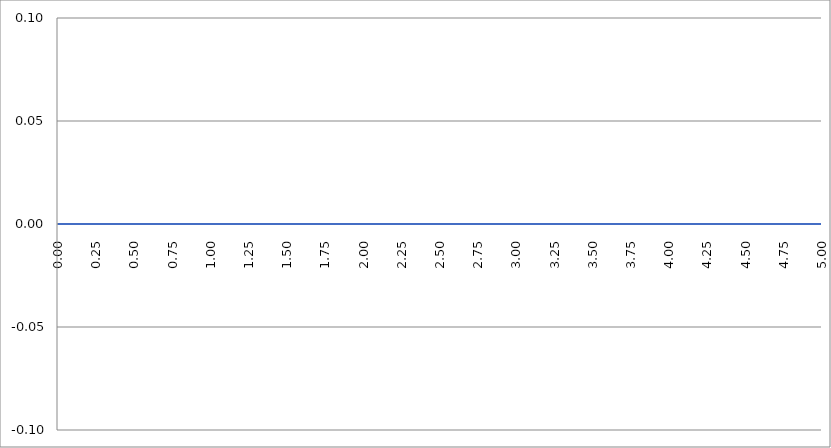
| Category | Series 1 | Series 0 | Series 2 |
|---|---|---|---|
| 0.0 | 0 |  |  |
| 0.0025 | 0 |  |  |
| 0.005 | 0 |  |  |
| 0.0075 | 0 |  |  |
| 0.01 | 0 |  |  |
| 0.0125 | 0 |  |  |
| 0.015 | 0 |  |  |
| 0.0175 | 0 |  |  |
| 0.02 | 0 |  |  |
| 0.0225 | 0 |  |  |
| 0.025 | 0 |  |  |
| 0.0275 | 0 |  |  |
| 0.03 | 0 |  |  |
| 0.0325 | 0 |  |  |
| 0.035 | 0 |  |  |
| 0.0375 | 0 |  |  |
| 0.04 | 0 |  |  |
| 0.0425 | 0 |  |  |
| 0.045 | 0 |  |  |
| 0.0475 | 0 |  |  |
| 0.05 | 0 |  |  |
| 0.0525 | 0 |  |  |
| 0.055 | 0 |  |  |
| 0.0575 | 0 |  |  |
| 0.06 | 0 |  |  |
| 0.0625 | 0 |  |  |
| 0.065 | 0 |  |  |
| 0.0675 | 0 |  |  |
| 0.07 | 0 |  |  |
| 0.0725 | 0 |  |  |
| 0.075 | 0 |  |  |
| 0.0775 | 0 |  |  |
| 0.08 | 0 |  |  |
| 0.0825 | 0 |  |  |
| 0.085 | 0 |  |  |
| 0.0875 | 0 |  |  |
| 0.09 | 0 |  |  |
| 0.0925 | 0 |  |  |
| 0.095 | 0 |  |  |
| 0.0975 | 0 |  |  |
| 0.1 | 0 |  |  |
| 0.1025 | 0 |  |  |
| 0.105 | 0 |  |  |
| 0.1075 | 0 |  |  |
| 0.11 | 0 |  |  |
| 0.1125 | 0 |  |  |
| 0.115 | 0 |  |  |
| 0.1175 | 0 |  |  |
| 0.12 | 0 |  |  |
| 0.1225 | 0 |  |  |
| 0.125 | 0 |  |  |
| 0.1275 | 0 |  |  |
| 0.13 | 0 |  |  |
| 0.1325 | 0 |  |  |
| 0.135 | 0 |  |  |
| 0.1375 | 0 |  |  |
| 0.14 | 0 |  |  |
| 0.1425 | 0 |  |  |
| 0.145 | 0 |  |  |
| 0.1475 | 0 |  |  |
| 0.15 | 0 |  |  |
| 0.1525 | 0 |  |  |
| 0.155 | 0 |  |  |
| 0.1575 | 0 |  |  |
| 0.16 | 0 |  |  |
| 0.1625 | 0 |  |  |
| 0.165 | 0 |  |  |
| 0.1675 | 0 |  |  |
| 0.17 | 0 |  |  |
| 0.1725 | 0 |  |  |
| 0.175 | 0 |  |  |
| 0.1775 | 0 |  |  |
| 0.18 | 0 |  |  |
| 0.1825 | 0 |  |  |
| 0.185 | 0 |  |  |
| 0.1875 | 0 |  |  |
| 0.19 | 0 |  |  |
| 0.1925 | 0 |  |  |
| 0.195 | 0 |  |  |
| 0.1975 | 0 |  |  |
| 0.2 | 0 |  |  |
| 0.2025 | 0 |  |  |
| 0.205 | 0 |  |  |
| 0.2075 | 0 |  |  |
| 0.21 | 0 |  |  |
| 0.2125 | 0 |  |  |
| 0.215 | 0 |  |  |
| 0.2175 | 0 |  |  |
| 0.22 | 0 |  |  |
| 0.2225 | 0 |  |  |
| 0.225 | 0 |  |  |
| 0.2275 | 0 |  |  |
| 0.23 | 0 |  |  |
| 0.2325 | 0 |  |  |
| 0.235 | 0 |  |  |
| 0.2375 | 0 |  |  |
| 0.24 | 0 |  |  |
| 0.2425 | 0 |  |  |
| 0.245 | 0 |  |  |
| 0.2475 | 0 |  |  |
| 0.25 | 0 |  |  |
| 0.2525 | 0 |  |  |
| 0.255 | 0 |  |  |
| 0.2575 | 0 |  |  |
| 0.26 | 0 |  |  |
| 0.2625 | 0 |  |  |
| 0.265 | 0 |  |  |
| 0.2675 | 0 |  |  |
| 0.27 | 0 |  |  |
| 0.2725 | 0 |  |  |
| 0.275 | 0 |  |  |
| 0.2775 | 0 |  |  |
| 0.28 | 0 |  |  |
| 0.2825 | 0 |  |  |
| 0.285 | 0 |  |  |
| 0.2875 | 0 |  |  |
| 0.29 | 0 |  |  |
| 0.2925 | 0 |  |  |
| 0.295 | 0 |  |  |
| 0.2975 | 0 |  |  |
| 0.3 | 0 |  |  |
| 0.3025 | 0 |  |  |
| 0.305 | 0 |  |  |
| 0.3075 | 0 |  |  |
| 0.31 | 0 |  |  |
| 0.3125 | 0 |  |  |
| 0.315 | 0 |  |  |
| 0.3175 | 0 |  |  |
| 0.32 | 0 |  |  |
| 0.3225 | 0 |  |  |
| 0.325 | 0 |  |  |
| 0.3275 | 0 |  |  |
| 0.33 | 0 |  |  |
| 0.3325 | 0 |  |  |
| 0.335 | 0 |  |  |
| 0.3375 | 0 |  |  |
| 0.34 | 0 |  |  |
| 0.3425 | 0 |  |  |
| 0.345 | 0 |  |  |
| 0.3475 | 0 |  |  |
| 0.35 | 0 |  |  |
| 0.3525 | 0 |  |  |
| 0.355 | 0 |  |  |
| 0.3575 | 0 |  |  |
| 0.36 | 0 |  |  |
| 0.3625 | 0 |  |  |
| 0.365 | 0 |  |  |
| 0.3675 | 0 |  |  |
| 0.37 | 0 |  |  |
| 0.3725 | 0 |  |  |
| 0.375 | 0 |  |  |
| 0.3775 | 0 |  |  |
| 0.38 | 0 |  |  |
| 0.3825 | 0 |  |  |
| 0.385 | 0 |  |  |
| 0.3875 | 0 |  |  |
| 0.39 | 0 |  |  |
| 0.3925 | 0 |  |  |
| 0.395 | 0 |  |  |
| 0.3975 | 0 |  |  |
| 0.4 | 0 |  |  |
| 0.4025 | 0 |  |  |
| 0.405 | 0 |  |  |
| 0.4075 | 0 |  |  |
| 0.41 | 0 |  |  |
| 0.4125 | 0 |  |  |
| 0.415 | 0 |  |  |
| 0.4175 | 0 |  |  |
| 0.42 | 0 |  |  |
| 0.4225 | 0 |  |  |
| 0.425 | 0 |  |  |
| 0.4275 | 0 |  |  |
| 0.43 | 0 |  |  |
| 0.4325 | 0 |  |  |
| 0.435 | 0 |  |  |
| 0.4375 | 0 |  |  |
| 0.44 | 0 |  |  |
| 0.4425 | 0 |  |  |
| 0.445 | 0 |  |  |
| 0.4475 | 0 |  |  |
| 0.45 | 0 |  |  |
| 0.4525 | 0 |  |  |
| 0.455 | 0 |  |  |
| 0.4575 | 0 |  |  |
| 0.46 | 0 |  |  |
| 0.4625 | 0 |  |  |
| 0.465 | 0 |  |  |
| 0.4675 | 0 |  |  |
| 0.47 | 0 |  |  |
| 0.4725 | 0 |  |  |
| 0.475 | 0 |  |  |
| 0.4775 | 0 |  |  |
| 0.48 | 0 |  |  |
| 0.4825 | 0 |  |  |
| 0.485 | 0 |  |  |
| 0.4875 | 0 |  |  |
| 0.49 | 0 |  |  |
| 0.4925 | 0 |  |  |
| 0.495 | 0 |  |  |
| 0.4975 | 0 |  |  |
| 0.5 | 0 |  |  |
| 0.5025 | 0 |  |  |
| 0.505 | 0 |  |  |
| 0.5075 | 0 |  |  |
| 0.51 | 0 |  |  |
| 0.5125 | 0 |  |  |
| 0.515 | 0 |  |  |
| 0.5175 | 0 |  |  |
| 0.52 | 0 |  |  |
| 0.5225 | 0 |  |  |
| 0.525 | 0 |  |  |
| 0.5275 | 0 |  |  |
| 0.53 | 0 |  |  |
| 0.5325 | 0 |  |  |
| 0.535 | 0 |  |  |
| 0.5375 | 0 |  |  |
| 0.539999999999999 | 0 |  |  |
| 0.542499999999999 | 0 |  |  |
| 0.544999999999999 | 0 |  |  |
| 0.547499999999999 | 0 |  |  |
| 0.549999999999999 | 0 |  |  |
| 0.552499999999999 | 0 |  |  |
| 0.554999999999999 | 0 |  |  |
| 0.557499999999999 | 0 |  |  |
| 0.559999999999999 | 0 |  |  |
| 0.562499999999999 | 0 |  |  |
| 0.564999999999999 | 0 |  |  |
| 0.567499999999999 | 0 |  |  |
| 0.569999999999999 | 0 |  |  |
| 0.572499999999999 | 0 |  |  |
| 0.574999999999999 | 0 |  |  |
| 0.577499999999999 | 0 |  |  |
| 0.579999999999999 | 0 |  |  |
| 0.582499999999999 | 0 |  |  |
| 0.584999999999999 | 0 |  |  |
| 0.587499999999998 | 0 |  |  |
| 0.589999999999998 | 0 |  |  |
| 0.592499999999998 | 0 |  |  |
| 0.594999999999998 | 0 |  |  |
| 0.597499999999998 | 0 |  |  |
| 0.599999999999998 | 0 |  |  |
| 0.602499999999998 | 0 |  |  |
| 0.604999999999998 | 0 |  |  |
| 0.607499999999998 | 0 |  |  |
| 0.609999999999998 | 0 |  |  |
| 0.612499999999998 | 0 |  |  |
| 0.614999999999998 | 0 |  |  |
| 0.617499999999998 | 0 |  |  |
| 0.619999999999998 | 0 |  |  |
| 0.622499999999998 | 0 |  |  |
| 0.624999999999998 | 0 |  |  |
| 0.627499999999998 | 0 |  |  |
| 0.629999999999997 | 0 |  |  |
| 0.632499999999997 | 0 |  |  |
| 0.634999999999997 | 0 |  |  |
| 0.637499999999997 | 0 |  |  |
| 0.639999999999997 | 0 |  |  |
| 0.642499999999997 | 0 |  |  |
| 0.644999999999997 | 0 |  |  |
| 0.647499999999997 | 0 |  |  |
| 0.649999999999997 | 0 |  |  |
| 0.652499999999997 | 0 |  |  |
| 0.654999999999997 | 0 |  |  |
| 0.657499999999997 | 0 |  |  |
| 0.659999999999997 | 0 |  |  |
| 0.662499999999997 | 0 |  |  |
| 0.664999999999997 | 0 |  |  |
| 0.667499999999997 | 0 |  |  |
| 0.669999999999997 | 0 |  |  |
| 0.672499999999997 | 0 |  |  |
| 0.674999999999997 | 0 |  |  |
| 0.677499999999996 | 0 |  |  |
| 0.679999999999996 | 0 |  |  |
| 0.682499999999996 | 0 |  |  |
| 0.684999999999996 | 0 |  |  |
| 0.687499999999996 | 0 |  |  |
| 0.689999999999996 | 0 |  |  |
| 0.692499999999996 | 0 |  |  |
| 0.694999999999996 | 0 |  |  |
| 0.697499999999996 | 0 |  |  |
| 0.699999999999996 | 0 |  |  |
| 0.702499999999996 | 0 |  |  |
| 0.704999999999996 | 0 |  |  |
| 0.707499999999996 | 0 |  |  |
| 0.709999999999996 | 0 |  |  |
| 0.712499999999996 | 0 |  |  |
| 0.714999999999996 | 0 |  |  |
| 0.717499999999996 | 0 |  |  |
| 0.719999999999996 | 0 |  |  |
| 0.722499999999996 | 0 |  |  |
| 0.724999999999995 | 0 |  |  |
| 0.727499999999995 | 0 |  |  |
| 0.729999999999995 | 0 |  |  |
| 0.732499999999995 | 0 |  |  |
| 0.734999999999995 | 0 |  |  |
| 0.737499999999995 | 0 |  |  |
| 0.739999999999995 | 0 |  |  |
| 0.742499999999995 | 0 |  |  |
| 0.744999999999995 | 0 |  |  |
| 0.747499999999995 | 0 |  |  |
| 0.749999999999995 | 0 |  |  |
| 0.752499999999995 | 0 |  |  |
| 0.754999999999995 | 0 |  |  |
| 0.757499999999995 | 0 |  |  |
| 0.759999999999995 | 0 |  |  |
| 0.762499999999995 | 0 |  |  |
| 0.764999999999995 | 0 |  |  |
| 0.767499999999995 | 0 |  |  |
| 0.769999999999994 | 0 |  |  |
| 0.772499999999994 | 0 |  |  |
| 0.774999999999994 | 0 |  |  |
| 0.777499999999994 | 0 |  |  |
| 0.779999999999994 | 0 |  |  |
| 0.782499999999994 | 0 |  |  |
| 0.784999999999994 | 0 |  |  |
| 0.787499999999994 | 0 |  |  |
| 0.789999999999994 | 0 |  |  |
| 0.792499999999994 | 0 |  |  |
| 0.794999999999994 | 0 |  |  |
| 0.797499999999994 | 0 |  |  |
| 0.799999999999994 | 0 |  |  |
| 0.802499999999994 | 0 |  |  |
| 0.804999999999994 | 0 |  |  |
| 0.807499999999994 | 0 |  |  |
| 0.809999999999994 | 0 |  |  |
| 0.812499999999994 | 0 |  |  |
| 0.814999999999994 | 0 |  |  |
| 0.817499999999994 | 0 |  |  |
| 0.819999999999993 | 0 |  |  |
| 0.822499999999993 | 0 |  |  |
| 0.824999999999993 | 0 |  |  |
| 0.827499999999993 | 0 |  |  |
| 0.829999999999993 | 0 |  |  |
| 0.832499999999993 | 0 |  |  |
| 0.834999999999993 | 0 |  |  |
| 0.837499999999993 | 0 |  |  |
| 0.839999999999993 | 0 |  |  |
| 0.842499999999993 | 0 |  |  |
| 0.844999999999993 | 0 |  |  |
| 0.847499999999993 | 0 |  |  |
| 0.849999999999993 | 0 |  |  |
| 0.852499999999993 | 0 |  |  |
| 0.854999999999993 | 0 |  |  |
| 0.857499999999993 | 0 |  |  |
| 0.859999999999993 | 0 |  |  |
| 0.862499999999993 | 0 |  |  |
| 0.864999999999992 | 0 |  |  |
| 0.867499999999992 | 0 |  |  |
| 0.869999999999992 | 0 |  |  |
| 0.872499999999992 | 0 |  |  |
| 0.874999999999992 | 0 |  |  |
| 0.877499999999992 | 0 |  |  |
| 0.879999999999992 | 0 |  |  |
| 0.882499999999992 | 0 |  |  |
| 0.884999999999992 | 0 |  |  |
| 0.887499999999992 | 0 |  |  |
| 0.889999999999992 | 0 |  |  |
| 0.892499999999992 | 0 |  |  |
| 0.894999999999992 | 0 |  |  |
| 0.897499999999992 | 0 |  |  |
| 0.899999999999992 | 0 |  |  |
| 0.902499999999992 | 0 |  |  |
| 0.904999999999992 | 0 |  |  |
| 0.907499999999992 | 0 |  |  |
| 0.909999999999992 | 0 |  |  |
| 0.912499999999992 | 0 |  |  |
| 0.914999999999991 | 0 |  |  |
| 0.917499999999991 | 0 |  |  |
| 0.919999999999991 | 0 |  |  |
| 0.922499999999991 | 0 |  |  |
| 0.924999999999991 | 0 |  |  |
| 0.927499999999991 | 0 |  |  |
| 0.929999999999991 | 0 |  |  |
| 0.932499999999991 | 0 |  |  |
| 0.934999999999991 | 0 |  |  |
| 0.937499999999991 | 0 |  |  |
| 0.939999999999991 | 0 |  |  |
| 0.942499999999991 | 0 |  |  |
| 0.944999999999991 | 0 |  |  |
| 0.947499999999991 | 0 |  |  |
| 0.949999999999991 | 0 |  |  |
| 0.952499999999991 | 0 |  |  |
| 0.954999999999991 | 0 |  |  |
| 0.957499999999991 | 0 |  |  |
| 0.95999999999999 | 0 |  |  |
| 0.96249999999999 | 0 |  |  |
| 0.96499999999999 | 0 |  |  |
| 0.96749999999999 | 0 |  |  |
| 0.96999999999999 | 0 |  |  |
| 0.97249999999999 | 0 |  |  |
| 0.97499999999999 | 0 |  |  |
| 0.97749999999999 | 0 |  |  |
| 0.97999999999999 | 0 |  |  |
| 0.98249999999999 | 0 |  |  |
| 0.98499999999999 | 0 |  |  |
| 0.98749999999999 | 0 |  |  |
| 0.98999999999999 | 0 |  |  |
| 0.99249999999999 | 0 |  |  |
| 0.99499999999999 | 0 |  |  |
| 0.99749999999999 | 0 |  |  |
| 0.99999999999999 | 0 |  |  |
| 1.00249999999999 | 0 |  |  |
| 1.00499999999999 | 0 |  |  |
| 1.00749999999999 | 0 |  |  |
| 1.00999999999999 | 0 |  |  |
| 1.01249999999999 | 0 |  |  |
| 1.014999999999989 | 0 |  |  |
| 1.017499999999989 | 0 |  |  |
| 1.019999999999989 | 0 |  |  |
| 1.022499999999989 | 0 |  |  |
| 1.024999999999989 | 0 |  |  |
| 1.027499999999989 | 0 |  |  |
| 1.029999999999989 | 0 |  |  |
| 1.032499999999989 | 0 |  |  |
| 1.034999999999989 | 0 |  |  |
| 1.037499999999989 | 0 |  |  |
| 1.039999999999989 | 0 |  |  |
| 1.042499999999989 | 0 |  |  |
| 1.044999999999989 | 0 |  |  |
| 1.047499999999989 | 0 |  |  |
| 1.049999999999989 | 0 |  |  |
| 1.052499999999989 | 0 |  |  |
| 1.054999999999989 | 0 |  |  |
| 1.057499999999989 | 0 |  |  |
| 1.059999999999988 | 0 |  |  |
| 1.062499999999988 | 0 |  |  |
| 1.064999999999988 | 0 |  |  |
| 1.067499999999988 | 0 |  |  |
| 1.069999999999988 | 0 |  |  |
| 1.072499999999988 | 0 |  |  |
| 1.074999999999988 | 0 |  |  |
| 1.077499999999988 | 0 |  |  |
| 1.079999999999988 | 0 |  |  |
| 1.082499999999988 | 0 |  |  |
| 1.084999999999988 | 0 |  |  |
| 1.087499999999988 | 0 |  |  |
| 1.089999999999988 | 0 |  |  |
| 1.092499999999988 | 0 |  |  |
| 1.094999999999988 | 0 |  |  |
| 1.097499999999988 | 0 |  |  |
| 1.099999999999988 | 0 |  |  |
| 1.102499999999988 | 0 |  |  |
| 1.104999999999988 | 0 |  |  |
| 1.107499999999987 | 0 |  |  |
| 1.109999999999987 | 0 |  |  |
| 1.112499999999987 | 0 |  |  |
| 1.114999999999987 | 0 |  |  |
| 1.117499999999987 | 0 |  |  |
| 1.119999999999987 | 0 |  |  |
| 1.122499999999987 | 0 |  |  |
| 1.124999999999987 | 0 |  |  |
| 1.127499999999987 | 0 |  |  |
| 1.129999999999987 | 0 |  |  |
| 1.132499999999987 | 0 |  |  |
| 1.134999999999987 | 0 |  |  |
| 1.137499999999987 | 0 |  |  |
| 1.139999999999987 | 0 |  |  |
| 1.142499999999987 | 0 |  |  |
| 1.144999999999987 | 0 |  |  |
| 1.147499999999987 | 0 |  |  |
| 1.149999999999987 | 0 |  |  |
| 1.152499999999987 | 0 |  |  |
| 1.154999999999986 | 0 |  |  |
| 1.157499999999986 | 0 |  |  |
| 1.159999999999986 | 0 |  |  |
| 1.162499999999986 | 0 |  |  |
| 1.164999999999986 | 0 |  |  |
| 1.167499999999986 | 0 |  |  |
| 1.169999999999986 | 0 |  |  |
| 1.172499999999986 | 0 |  |  |
| 1.174999999999986 | 0 |  |  |
| 1.177499999999986 | 0 |  |  |
| 1.179999999999986 | 0 |  |  |
| 1.182499999999986 | 0 |  |  |
| 1.184999999999986 | 0 |  |  |
| 1.187499999999986 | 0 |  |  |
| 1.189999999999986 | 0 |  |  |
| 1.192499999999986 | 0 |  |  |
| 1.194999999999986 | 0 |  |  |
| 1.197499999999986 | 0 |  |  |
| 1.199999999999985 | 0 |  |  |
| 1.202499999999985 | 0 |  |  |
| 1.204999999999985 | 0 |  |  |
| 1.207499999999985 | 0 |  |  |
| 1.209999999999985 | 0 |  |  |
| 1.212499999999985 | 0 |  |  |
| 1.214999999999985 | 0 |  |  |
| 1.217499999999985 | 0 |  |  |
| 1.219999999999985 | 0 |  |  |
| 1.222499999999985 | 0 |  |  |
| 1.224999999999985 | 0 |  |  |
| 1.227499999999985 | 0 |  |  |
| 1.229999999999985 | 0 |  |  |
| 1.232499999999985 | 0 |  |  |
| 1.234999999999985 | 0 |  |  |
| 1.237499999999985 | 0 |  |  |
| 1.239999999999985 | 0 |  |  |
| 1.242499999999985 | 0 |  |  |
| 1.244999999999985 | 0 |  |  |
| 1.247499999999984 | 0 |  |  |
| 1.249999999999984 | 0 |  |  |
| 1.252499999999984 | 0 |  |  |
| 1.254999999999984 | 0 |  |  |
| 1.257499999999984 | 0 |  |  |
| 1.259999999999984 | 0 |  |  |
| 1.262499999999984 | 0 |  |  |
| 1.264999999999984 | 0 |  |  |
| 1.267499999999984 | 0 |  |  |
| 1.269999999999984 | 0 |  |  |
| 1.272499999999984 | 0 |  |  |
| 1.274999999999984 | 0 |  |  |
| 1.277499999999984 | 0 |  |  |
| 1.279999999999984 | 0 |  |  |
| 1.282499999999984 | 0 |  |  |
| 1.284999999999984 | 0 |  |  |
| 1.287499999999984 | 0 |  |  |
| 1.289999999999984 | 0 |  |  |
| 1.292499999999984 | 0 |  |  |
| 1.294999999999983 | 0 |  |  |
| 1.297499999999983 | 0 |  |  |
| 1.299999999999983 | 0 |  |  |
| 1.302499999999983 | 0 |  |  |
| 1.304999999999983 | 0 |  |  |
| 1.307499999999983 | 0 |  |  |
| 1.309999999999983 | 0 |  |  |
| 1.312499999999983 | 0 |  |  |
| 1.314999999999983 | 0 |  |  |
| 1.317499999999983 | 0 |  |  |
| 1.319999999999983 | 0 |  |  |
| 1.322499999999983 | 0 |  |  |
| 1.324999999999983 | 0 |  |  |
| 1.327499999999983 | 0 |  |  |
| 1.329999999999983 | 0 |  |  |
| 1.332499999999983 | 0 |  |  |
| 1.334999999999983 | 0 |  |  |
| 1.337499999999983 | 0 |  |  |
| 1.339999999999982 | 0 |  |  |
| 1.342499999999982 | 0 |  |  |
| 1.344999999999982 | 0 |  |  |
| 1.347499999999982 | 0 |  |  |
| 1.349999999999982 | 0 |  |  |
| 1.352499999999982 | 0 |  |  |
| 1.354999999999982 | 0 |  |  |
| 1.357499999999982 | 0 |  |  |
| 1.359999999999982 | 0 |  |  |
| 1.362499999999982 | 0 |  |  |
| 1.364999999999982 | 0 |  |  |
| 1.367499999999982 | 0 |  |  |
| 1.369999999999982 | 0 |  |  |
| 1.372499999999982 | 0 |  |  |
| 1.374999999999982 | 0 |  |  |
| 1.377499999999982 | 0 |  |  |
| 1.379999999999982 | 0 |  |  |
| 1.382499999999982 | 0 |  |  |
| 1.384999999999982 | 0 |  |  |
| 1.387499999999981 | 0 |  |  |
| 1.389999999999981 | 0 |  |  |
| 1.392499999999981 | 0 |  |  |
| 1.394999999999981 | 0 |  |  |
| 1.397499999999981 | 0 |  |  |
| 1.399999999999981 | 0 |  |  |
| 1.402499999999981 | 0 |  |  |
| 1.404999999999981 | 0 |  |  |
| 1.407499999999981 | 0 |  |  |
| 1.409999999999981 | 0 |  |  |
| 1.412499999999981 | 0 |  |  |
| 1.414999999999981 | 0 |  |  |
| 1.417499999999981 | 0 |  |  |
| 1.419999999999981 | 0 |  |  |
| 1.422499999999981 | 0 |  |  |
| 1.424999999999981 | 0 |  |  |
| 1.427499999999981 | 0 |  |  |
| 1.429999999999981 | 0 |  |  |
| 1.432499999999981 | 0 |  |  |
| 1.43499999999998 | 0 |  |  |
| 1.43749999999998 | 0 |  |  |
| 1.43999999999998 | 0 |  |  |
| 1.44249999999998 | 0 |  |  |
| 1.44499999999998 | 0 |  |  |
| 1.44749999999998 | 0 |  |  |
| 1.44999999999998 | 0 |  |  |
| 1.45249999999998 | 0 |  |  |
| 1.45499999999998 | 0 |  |  |
| 1.45749999999998 | 0 |  |  |
| 1.45999999999998 | 0 |  |  |
| 1.46249999999998 | 0 |  |  |
| 1.46499999999998 | 0 |  |  |
| 1.46749999999998 | 0 |  |  |
| 1.46999999999998 | 0 |  |  |
| 1.47249999999998 | 0 |  |  |
| 1.47499999999998 | 0 |  |  |
| 1.47749999999998 | 0 |  |  |
| 1.47999999999998 | 0 |  |  |
| 1.482499999999979 | 0 |  |  |
| 1.484999999999979 | 0 |  |  |
| 1.487499999999979 | 0 |  |  |
| 1.489999999999979 | 0 |  |  |
| 1.492499999999979 | 0 |  |  |
| 1.494999999999979 | 0 |  |  |
| 1.497499999999979 | 0 |  |  |
| 1.499999999999979 | 0 |  |  |
| 1.502499999999979 | 0 |  |  |
| 1.504999999999979 | 0 |  |  |
| 1.507499999999979 | 0 |  |  |
| 1.509999999999979 | 0 |  |  |
| 1.512499999999979 | 0 |  |  |
| 1.514999999999979 | 0 |  |  |
| 1.517499999999979 | 0 |  |  |
| 1.519999999999979 | 0 |  |  |
| 1.522499999999979 | 0 |  |  |
| 1.524999999999979 | 0 |  |  |
| 1.527499999999979 | 0 |  |  |
| 1.529999999999978 | 0 |  |  |
| 1.532499999999978 | 0 |  |  |
| 1.534999999999978 | 0 |  |  |
| 1.537499999999978 | 0 |  |  |
| 1.539999999999978 | 0 |  |  |
| 1.542499999999978 | 0 |  |  |
| 1.544999999999978 | 0 |  |  |
| 1.547499999999978 | 0 |  |  |
| 1.549999999999978 | 0 |  |  |
| 1.552499999999978 | 0 |  |  |
| 1.554999999999978 | 0 |  |  |
| 1.557499999999978 | 0 |  |  |
| 1.559999999999978 | 0 |  |  |
| 1.562499999999978 | 0 |  |  |
| 1.564999999999978 | 0 |  |  |
| 1.567499999999978 | 0 |  |  |
| 1.569999999999978 | 0 |  |  |
| 1.572499999999978 | 0 |  |  |
| 1.574999999999978 | 0 |  |  |
| 1.577499999999977 | 0 |  |  |
| 1.579999999999977 | 0 |  |  |
| 1.582499999999977 | 0 |  |  |
| 1.584999999999977 | 0 |  |  |
| 1.587499999999977 | 0 |  |  |
| 1.589999999999977 | 0 |  |  |
| 1.592499999999977 | 0 |  |  |
| 1.594999999999977 | 0 |  |  |
| 1.597499999999977 | 0 |  |  |
| 1.599999999999977 | 0 |  |  |
| 1.602499999999977 | 0 |  |  |
| 1.604999999999977 | 0 |  |  |
| 1.607499999999977 | 0 |  |  |
| 1.609999999999977 | 0 |  |  |
| 1.612499999999977 | 0 |  |  |
| 1.614999999999977 | 0 |  |  |
| 1.617499999999977 | 0 |  |  |
| 1.619999999999976 | 0 |  |  |
| 1.622499999999976 | 0 |  |  |
| 1.624999999999976 | 0 |  |  |
| 1.627499999999976 | 0 |  |  |
| 1.629999999999976 | 0 |  |  |
| 1.632499999999976 | 0 |  |  |
| 1.634999999999976 | 0 |  |  |
| 1.637499999999976 | 0 |  |  |
| 1.639999999999976 | 0 |  |  |
| 1.642499999999976 | 0 |  |  |
| 1.644999999999976 | 0 |  |  |
| 1.647499999999976 | 0 |  |  |
| 1.649999999999976 | 0 |  |  |
| 1.652499999999976 | 0 |  |  |
| 1.654999999999976 | 0 |  |  |
| 1.657499999999976 | 0 |  |  |
| 1.659999999999976 | 0 |  |  |
| 1.662499999999976 | 0 |  |  |
| 1.664999999999976 | 0 |  |  |
| 1.667499999999975 | 0 |  |  |
| 1.669999999999975 | 0 |  |  |
| 1.672499999999975 | 0 |  |  |
| 1.674999999999975 | 0 |  |  |
| 1.677499999999975 | 0 |  |  |
| 1.679999999999975 | 0 |  |  |
| 1.682499999999975 | 0 |  |  |
| 1.684999999999975 | 0 |  |  |
| 1.687499999999975 | 0 |  |  |
| 1.689999999999975 | 0 |  |  |
| 1.692499999999975 | 0 |  |  |
| 1.694999999999975 | 0 |  |  |
| 1.697499999999975 | 0 |  |  |
| 1.699999999999975 | 0 |  |  |
| 1.702499999999975 | 0 |  |  |
| 1.704999999999975 | 0 |  |  |
| 1.707499999999975 | 0 |  |  |
| 1.709999999999975 | 0 |  |  |
| 1.712499999999975 | 0 |  |  |
| 1.714999999999974 | 0 |  |  |
| 1.717499999999974 | 0 |  |  |
| 1.719999999999974 | 0 |  |  |
| 1.722499999999974 | 0 |  |  |
| 1.724999999999974 | 0 |  |  |
| 1.727499999999974 | 0 |  |  |
| 1.729999999999974 | 0 |  |  |
| 1.732499999999974 | 0 |  |  |
| 1.734999999999974 | 0 |  |  |
| 1.737499999999974 | 0 |  |  |
| 1.739999999999974 | 0 |  |  |
| 1.742499999999974 | 0 |  |  |
| 1.744999999999974 | 0 |  |  |
| 1.747499999999974 | 0 |  |  |
| 1.749999999999974 | 0 |  |  |
| 1.752499999999974 | 0 |  |  |
| 1.754999999999974 | 0 |  |  |
| 1.757499999999974 | 0 |  |  |
| 1.759999999999974 | 0 |  |  |
| 1.762499999999973 | 0 |  |  |
| 1.764999999999973 | 0 |  |  |
| 1.767499999999973 | 0 |  |  |
| 1.769999999999973 | 0 |  |  |
| 1.772499999999973 | 0 |  |  |
| 1.774999999999973 | 0 |  |  |
| 1.777499999999973 | 0 |  |  |
| 1.779999999999973 | 0 |  |  |
| 1.782499999999973 | 0 |  |  |
| 1.784999999999973 | 0 |  |  |
| 1.787499999999973 | 0 |  |  |
| 1.789999999999973 | 0 |  |  |
| 1.792499999999973 | 0 |  |  |
| 1.794999999999973 | 0 |  |  |
| 1.797499999999973 | 0 |  |  |
| 1.799999999999973 | 0 |  |  |
| 1.802499999999973 | 0 |  |  |
| 1.804999999999973 | 0 |  |  |
| 1.807499999999973 | 0 |  |  |
| 1.809999999999972 | 0 |  |  |
| 1.812499999999972 | 0 |  |  |
| 1.814999999999972 | 0 |  |  |
| 1.817499999999972 | 0 |  |  |
| 1.819999999999972 | 0 |  |  |
| 1.822499999999972 | 0 |  |  |
| 1.824999999999972 | 0 |  |  |
| 1.827499999999972 | 0 |  |  |
| 1.829999999999972 | 0 |  |  |
| 1.832499999999972 | 0 |  |  |
| 1.834999999999972 | 0 |  |  |
| 1.837499999999972 | 0 |  |  |
| 1.839999999999972 | 0 |  |  |
| 1.842499999999972 | 0 |  |  |
| 1.844999999999972 | 0 |  |  |
| 1.847499999999972 | 0 |  |  |
| 1.849999999999972 | 0 |  |  |
| 1.852499999999972 | 0 |  |  |
| 1.854999999999972 | 0 |  |  |
| 1.857499999999971 | 0 |  |  |
| 1.859999999999971 | 0 |  |  |
| 1.862499999999971 | 0 |  |  |
| 1.864999999999971 | 0 |  |  |
| 1.867499999999971 | 0 |  |  |
| 1.869999999999971 | 0 |  |  |
| 1.872499999999971 | 0 |  |  |
| 1.874999999999971 | 0 |  |  |
| 1.877499999999971 | 0 |  |  |
| 1.879999999999971 | 0 |  |  |
| 1.882499999999971 | 0 |  |  |
| 1.884999999999971 | 0 |  |  |
| 1.887499999999971 | 0 |  |  |
| 1.889999999999971 | 0 |  |  |
| 1.892499999999971 | 0 |  |  |
| 1.894999999999971 | 0 |  |  |
| 1.897499999999971 | 0 |  |  |
| 1.899999999999971 | 0 |  |  |
| 1.902499999999971 | 0 |  |  |
| 1.90499999999997 | 0 |  |  |
| 1.90749999999997 | 0 |  |  |
| 1.90999999999997 | 0 |  |  |
| 1.91249999999997 | 0 |  |  |
| 1.91499999999997 | 0 |  |  |
| 1.91749999999997 | 0 |  |  |
| 1.91999999999997 | 0 |  |  |
| 1.92249999999997 | 0 |  |  |
| 1.92499999999997 | 0 |  |  |
| 1.92749999999997 | 0 |  |  |
| 1.92999999999997 | 0 |  |  |
| 1.93249999999997 | 0 |  |  |
| 1.93499999999997 | 0 |  |  |
| 1.93749999999997 | 0 |  |  |
| 1.93999999999997 | 0 |  |  |
| 1.94249999999997 | 0 |  |  |
| 1.94499999999997 | 0 |  |  |
| 1.94749999999997 | 0 |  |  |
| 1.94999999999997 | 0 |  |  |
| 1.952499999999969 | 0 |  |  |
| 1.954999999999969 | 0 |  |  |
| 1.957499999999969 | 0 |  |  |
| 1.959999999999969 | 0 |  |  |
| 1.962499999999969 | 0 |  |  |
| 1.964999999999969 | 0 |  |  |
| 1.967499999999969 | 0 |  |  |
| 1.969999999999969 | 0 |  |  |
| 1.972499999999969 | 0 |  |  |
| 1.974999999999969 | 0 |  |  |
| 1.977499999999969 | 0 |  |  |
| 1.979999999999969 | 0 |  |  |
| 1.982499999999969 | 0 |  |  |
| 1.984999999999969 | 0 |  |  |
| 1.987499999999969 | 0 |  |  |
| 1.989999999999969 | 0 |  |  |
| 1.992499999999969 | 0 |  |  |
| 1.994999999999969 | 0 |  |  |
| 1.997499999999968 | 0 |  |  |
| 1.999999999999968 | 0 |  |  |
| 2.002499999999968 | 0 |  |  |
| 2.004999999999968 | 0 |  |  |
| 2.007499999999968 | 0 |  |  |
| 2.009999999999968 | 0 |  |  |
| 2.012499999999968 | 0 |  |  |
| 2.014999999999968 | 0 |  |  |
| 2.017499999999968 | 0 |  |  |
| 2.019999999999968 | 0 |  |  |
| 2.022499999999968 | 0 |  |  |
| 2.024999999999968 | 0 |  |  |
| 2.027499999999968 | 0 |  |  |
| 2.029999999999968 | 0 |  |  |
| 2.032499999999968 | 0 |  |  |
| 2.034999999999968 | 0 |  |  |
| 2.037499999999968 | 0 |  |  |
| 2.039999999999968 | 0 |  |  |
| 2.042499999999968 | 0 |  |  |
| 2.044999999999968 | 0 |  |  |
| 2.047499999999967 | 0 |  |  |
| 2.049999999999967 | 0 |  |  |
| 2.052499999999967 | 0 |  |  |
| 2.054999999999967 | 0 |  |  |
| 2.057499999999967 | 0 |  |  |
| 2.059999999999967 | 0 |  |  |
| 2.062499999999967 | 0 |  |  |
| 2.064999999999967 | 0 |  |  |
| 2.067499999999967 | 0 |  |  |
| 2.069999999999967 | 0 |  |  |
| 2.072499999999967 | 0 |  |  |
| 2.074999999999967 | 0 |  |  |
| 2.077499999999967 | 0 |  |  |
| 2.079999999999967 | 0 |  |  |
| 2.082499999999967 | 0 |  |  |
| 2.084999999999967 | 0 |  |  |
| 2.087499999999967 | 0 |  |  |
| 2.089999999999967 | 0 |  |  |
| 2.092499999999966 | 0 |  |  |
| 2.094999999999966 | 0 |  |  |
| 2.097499999999966 | 0 |  |  |
| 2.099999999999966 | 0 |  |  |
| 2.102499999999966 | 0 |  |  |
| 2.104999999999966 | 0 |  |  |
| 2.107499999999966 | 0 |  |  |
| 2.109999999999966 | 0 |  |  |
| 2.112499999999966 | 0 |  |  |
| 2.114999999999966 | 0 |  |  |
| 2.117499999999966 | 0 |  |  |
| 2.119999999999966 | 0 |  |  |
| 2.122499999999966 | 0 |  |  |
| 2.124999999999966 | 0 |  |  |
| 2.127499999999966 | 0 |  |  |
| 2.129999999999966 | 0 |  |  |
| 2.132499999999966 | 0 |  |  |
| 2.134999999999966 | 0 |  |  |
| 2.137499999999966 | 0 |  |  |
| 2.139999999999965 | 0 |  |  |
| 2.142499999999965 | 0 |  |  |
| 2.144999999999965 | 0 |  |  |
| 2.147499999999965 | 0 |  |  |
| 2.149999999999965 | 0 |  |  |
| 2.152499999999965 | 0 |  |  |
| 2.154999999999965 | 0 |  |  |
| 2.157499999999965 | 0 |  |  |
| 2.159999999999965 | 0 |  |  |
| 2.162499999999965 | 0 |  |  |
| 2.164999999999965 | 0 |  |  |
| 2.167499999999965 | 0 |  |  |
| 2.169999999999965 | 0 |  |  |
| 2.172499999999965 | 0 |  |  |
| 2.174999999999965 | 0 |  |  |
| 2.177499999999965 | 0 |  |  |
| 2.179999999999965 | 0 |  |  |
| 2.182499999999965 | 0 |  |  |
| 2.184999999999965 | 0 |  |  |
| 2.187499999999964 | 0 |  |  |
| 2.189999999999964 | 0 |  |  |
| 2.192499999999964 | 0 |  |  |
| 2.194999999999964 | 0 |  |  |
| 2.197499999999964 | 0 |  |  |
| 2.199999999999964 | 0 |  |  |
| 2.202499999999964 | 0 |  |  |
| 2.204999999999964 | 0 |  |  |
| 2.207499999999964 | 0 |  |  |
| 2.209999999999964 | 0 |  |  |
| 2.212499999999964 | 0 |  |  |
| 2.214999999999964 | 0 |  |  |
| 2.217499999999964 | 0 |  |  |
| 2.219999999999964 | 0 |  |  |
| 2.222499999999964 | 0 |  |  |
| 2.224999999999964 | 0 |  |  |
| 2.227499999999964 | 0 |  |  |
| 2.229999999999964 | 0 |  |  |
| 2.232499999999963 | 0 |  |  |
| 2.234999999999963 | 0 |  |  |
| 2.237499999999963 | 0 |  |  |
| 2.239999999999963 | 0 |  |  |
| 2.242499999999963 | 0 |  |  |
| 2.244999999999963 | 0 |  |  |
| 2.247499999999963 | 0 |  |  |
| 2.249999999999963 | 0 |  |  |
| 2.252499999999963 | 0 |  |  |
| 2.254999999999963 | 0 |  |  |
| 2.257499999999963 | 0 |  |  |
| 2.259999999999963 | 0 |  |  |
| 2.262499999999963 | 0 |  |  |
| 2.264999999999963 | 0 |  |  |
| 2.267499999999963 | 0 |  |  |
| 2.269999999999963 | 0 |  |  |
| 2.272499999999963 | 0 |  |  |
| 2.274999999999963 | 0 |  |  |
| 2.277499999999963 | 0 |  |  |
| 2.279999999999962 | 0 |  |  |
| 2.282499999999962 | 0 |  |  |
| 2.284999999999962 | 0 |  |  |
| 2.287499999999962 | 0 |  |  |
| 2.289999999999962 | 0 |  |  |
| 2.292499999999962 | 0 |  |  |
| 2.294999999999962 | 0 |  |  |
| 2.297499999999962 | 0 |  |  |
| 2.299999999999962 | 0 |  |  |
| 2.302499999999962 | 0 |  |  |
| 2.304999999999962 | 0 |  |  |
| 2.307499999999962 | 0 |  |  |
| 2.309999999999962 | 0 |  |  |
| 2.312499999999962 | 0 |  |  |
| 2.314999999999962 | 0 |  |  |
| 2.317499999999962 | 0 |  |  |
| 2.319999999999962 | 0 |  |  |
| 2.322499999999962 | 0 |  |  |
| 2.324999999999961 | 0 |  |  |
| 2.327499999999961 | 0 |  |  |
| 2.329999999999961 | 0 |  |  |
| 2.332499999999961 | 0 |  |  |
| 2.334999999999961 | 0 |  |  |
| 2.337499999999961 | 0 |  |  |
| 2.339999999999961 | 0 |  |  |
| 2.342499999999961 | 0 |  |  |
| 2.344999999999961 | 0 |  |  |
| 2.347499999999961 | 0 |  |  |
| 2.349999999999961 | 0 |  |  |
| 2.352499999999961 | 0 |  |  |
| 2.354999999999961 | 0 |  |  |
| 2.357499999999961 | 0 |  |  |
| 2.359999999999961 | 0 |  |  |
| 2.362499999999961 | 0 |  |  |
| 2.364999999999961 | 0 |  |  |
| 2.367499999999961 | 0 |  |  |
| 2.369999999999961 | 0 |  |  |
| 2.37249999999996 | 0 |  |  |
| 2.37499999999996 | 0 |  |  |
| 2.37749999999996 | 0 |  |  |
| 2.37999999999996 | 0 |  |  |
| 2.38249999999996 | 0 |  |  |
| 2.38499999999996 | 0 |  |  |
| 2.38749999999996 | 0 |  |  |
| 2.38999999999996 | 0 |  |  |
| 2.39249999999996 | 0 |  |  |
| 2.39499999999996 | 0 |  |  |
| 2.39749999999996 | 0 |  |  |
| 2.39999999999996 | 0 |  |  |
| 2.40249999999996 | 0 |  |  |
| 2.40499999999996 | 0 |  |  |
| 2.40749999999996 | 0 |  |  |
| 2.40999999999996 | 0 |  |  |
| 2.41249999999996 | 0 |  |  |
| 2.41499999999996 | 0 |  |  |
| 2.41749999999996 | 0 |  |  |
| 2.419999999999959 | 0 |  |  |
| 2.422499999999959 | 0 |  |  |
| 2.424999999999959 | 0 |  |  |
| 2.427499999999959 | 0 |  |  |
| 2.429999999999959 | 0 |  |  |
| 2.432499999999959 | 0 |  |  |
| 2.434999999999959 | 0 |  |  |
| 2.437499999999959 | 0 |  |  |
| 2.439999999999959 | 0 |  |  |
| 2.442499999999959 | 0 |  |  |
| 2.444999999999959 | 0 |  |  |
| 2.447499999999959 | 0 |  |  |
| 2.449999999999959 | 0 |  |  |
| 2.452499999999959 | 0 |  |  |
| 2.454999999999959 | 0 |  |  |
| 2.457499999999959 | 0 |  |  |
| 2.459999999999959 | 0 |  |  |
| 2.462499999999959 | 0 |  |  |
| 2.464999999999959 | 0 |  |  |
| 2.467499999999958 | 0 |  |  |
| 2.469999999999958 | 0 |  |  |
| 2.472499999999958 | 0 |  |  |
| 2.474999999999958 | 0 |  |  |
| 2.477499999999958 | 0 |  |  |
| 2.479999999999958 | 0 |  |  |
| 2.482499999999958 | 0 |  |  |
| 2.484999999999958 | 0 |  |  |
| 2.487499999999958 | 0 |  |  |
| 2.489999999999958 | 0 |  |  |
| 2.492499999999958 | 0 |  |  |
| 2.494999999999958 | 0 |  |  |
| 2.497499999999958 | 0 |  |  |
| 2.499999999999958 | 0 |  |  |
| 2.502499999999958 | 0 |  |  |
| 2.504999999999958 | 0 |  |  |
| 2.507499999999958 | 0 |  |  |
| 2.509999999999958 | 0 |  |  |
| 2.512499999999958 | 0 |  |  |
| 2.514999999999957 | 0 |  |  |
| 2.517499999999957 | 0 |  |  |
| 2.519999999999957 | 0 |  |  |
| 2.522499999999957 | 0 |  |  |
| 2.524999999999957 | 0 |  |  |
| 2.527499999999957 | 0 |  |  |
| 2.529999999999957 | 0 |  |  |
| 2.532499999999957 | 0 |  |  |
| 2.534999999999957 | 0 |  |  |
| 2.537499999999957 | 0 |  |  |
| 2.539999999999957 | 0 |  |  |
| 2.542499999999957 | 0 |  |  |
| 2.544999999999957 | 0 |  |  |
| 2.547499999999957 | 0 |  |  |
| 2.549999999999957 | 0 |  |  |
| 2.552499999999957 | 0 |  |  |
| 2.554999999999957 | 0 |  |  |
| 2.557499999999957 | 0 |  |  |
| 2.559999999999957 | 0 |  |  |
| 2.562499999999956 | 0 |  |  |
| 2.564999999999956 | 0 |  |  |
| 2.567499999999956 | 0 |  |  |
| 2.569999999999956 | 0 |  |  |
| 2.572499999999956 | 0 |  |  |
| 2.574999999999956 | 0 |  |  |
| 2.577499999999956 | 0 |  |  |
| 2.579999999999956 | 0 |  |  |
| 2.582499999999956 | 0 |  |  |
| 2.584999999999956 | 0 |  |  |
| 2.587499999999956 | 0 |  |  |
| 2.589999999999956 | 0 |  |  |
| 2.592499999999956 | 0 |  |  |
| 2.594999999999956 | 0 |  |  |
| 2.597499999999956 | 0 |  |  |
| 2.599999999999956 | 0 |  |  |
| 2.602499999999956 | 0 |  |  |
| 2.604999999999955 | 0 |  |  |
| 2.607499999999955 | 0 |  |  |
| 2.609999999999955 | 0 |  |  |
| 2.612499999999955 | 0 |  |  |
| 2.614999999999955 | 0 |  |  |
| 2.617499999999955 | 0 |  |  |
| 2.619999999999955 | 0 |  |  |
| 2.622499999999955 | 0 |  |  |
| 2.624999999999955 | 0 |  |  |
| 2.627499999999955 | 0 |  |  |
| 2.629999999999955 | 0 |  |  |
| 2.632499999999955 | 0 |  |  |
| 2.634999999999955 | 0 |  |  |
| 2.637499999999955 | 0 |  |  |
| 2.639999999999955 | 0 |  |  |
| 2.642499999999955 | 0 |  |  |
| 2.644999999999955 | 0 |  |  |
| 2.647499999999955 | 0 |  |  |
| 2.649999999999955 | 0 |  |  |
| 2.652499999999954 | 0 |  |  |
| 2.654999999999954 | 0 |  |  |
| 2.657499999999954 | 0 |  |  |
| 2.659999999999954 | 0 |  |  |
| 2.662499999999954 | 0 |  |  |
| 2.664999999999954 | 0 |  |  |
| 2.667499999999954 | 0 |  |  |
| 2.669999999999954 | 0 |  |  |
| 2.672499999999954 | 0 |  |  |
| 2.674999999999954 | 0 |  |  |
| 2.677499999999954 | 0 |  |  |
| 2.679999999999954 | 0 |  |  |
| 2.682499999999954 | 0 |  |  |
| 2.684999999999954 | 0 |  |  |
| 2.687499999999954 | 0 |  |  |
| 2.689999999999954 | 0 |  |  |
| 2.692499999999954 | 0 |  |  |
| 2.694999999999954 | 0 |  |  |
| 2.697499999999953 | 0 |  |  |
| 2.699999999999953 | 0 |  |  |
| 2.702499999999953 | 0 |  |  |
| 2.704999999999953 | 0 |  |  |
| 2.707499999999953 | 0 |  |  |
| 2.709999999999953 | 0 |  |  |
| 2.712499999999953 | 0 |  |  |
| 2.714999999999953 | 0 |  |  |
| 2.717499999999953 | 0 |  |  |
| 2.719999999999953 | 0 |  |  |
| 2.722499999999953 | 0 |  |  |
| 2.724999999999953 | 0 |  |  |
| 2.727499999999953 | 0 |  |  |
| 2.729999999999953 | 0 |  |  |
| 2.732499999999953 | 0 |  |  |
| 2.734999999999953 | 0 |  |  |
| 2.737499999999953 | 0 |  |  |
| 2.739999999999953 | 0 |  |  |
| 2.742499999999953 | 0 |  |  |
| 2.744999999999952 | 0 |  |  |
| 2.747499999999952 | 0 |  |  |
| 2.749999999999952 | 0 |  |  |
| 2.752499999999952 | 0 |  |  |
| 2.754999999999952 | 0 |  |  |
| 2.757499999999952 | 0 |  |  |
| 2.759999999999952 | 0 |  |  |
| 2.762499999999952 | 0 |  |  |
| 2.764999999999952 | 0 |  |  |
| 2.767499999999952 | 0 |  |  |
| 2.769999999999952 | 0 |  |  |
| 2.772499999999952 | 0 |  |  |
| 2.774999999999952 | 0 |  |  |
| 2.777499999999952 | 0 |  |  |
| 2.779999999999952 | 0 |  |  |
| 2.782499999999952 | 0 |  |  |
| 2.784999999999952 | 0 |  |  |
| 2.787499999999952 | 0 |  |  |
| 2.789999999999952 | 0 |  |  |
| 2.792499999999951 | 0 |  |  |
| 2.794999999999951 | 0 |  |  |
| 2.797499999999951 | 0 |  |  |
| 2.799999999999951 | 0 |  |  |
| 2.802499999999951 | 0 |  |  |
| 2.804999999999951 | 0 |  |  |
| 2.807499999999951 | 0 |  |  |
| 2.809999999999951 | 0 |  |  |
| 2.812499999999951 | 0 |  |  |
| 2.814999999999951 | 0 |  |  |
| 2.817499999999951 | 0 |  |  |
| 2.819999999999951 | 0 |  |  |
| 2.822499999999951 | 0 |  |  |
| 2.824999999999951 | 0 |  |  |
| 2.827499999999951 | 0 |  |  |
| 2.829999999999951 | 0 |  |  |
| 2.832499999999951 | 0 |  |  |
| 2.834999999999951 | 0 |  |  |
| 2.837499999999951 | 0 |  |  |
| 2.839999999999951 | 0 |  |  |
| 2.84249999999995 | 0 |  |  |
| 2.84499999999995 | 0 |  |  |
| 2.84749999999995 | 0 |  |  |
| 2.84999999999995 | 0 |  |  |
| 2.85249999999995 | 0 |  |  |
| 2.85499999999995 | 0 |  |  |
| 2.85749999999995 | 0 |  |  |
| 2.85999999999995 | 0 |  |  |
| 2.86249999999995 | 0 |  |  |
| 2.86499999999995 | 0 |  |  |
| 2.86749999999995 | 0 |  |  |
| 2.86999999999995 | 0 |  |  |
| 2.87249999999995 | 0 |  |  |
| 2.87499999999995 | 0 |  |  |
| 2.87749999999995 | 0 |  |  |
| 2.87999999999995 | 0 |  |  |
| 2.88249999999995 | 0 |  |  |
| 2.88499999999995 | 0 |  |  |
| 2.887499999999949 | 0 |  |  |
| 2.889999999999949 | 0 |  |  |
| 2.892499999999949 | 0 |  |  |
| 2.894999999999949 | 0 |  |  |
| 2.897499999999949 | 0 |  |  |
| 2.899999999999949 | 0 |  |  |
| 2.902499999999949 | 0 |  |  |
| 2.904999999999949 | 0 |  |  |
| 2.907499999999949 | 0 |  |  |
| 2.909999999999949 | 0 |  |  |
| 2.912499999999949 | 0 |  |  |
| 2.914999999999949 | 0 |  |  |
| 2.917499999999949 | 0 |  |  |
| 2.919999999999949 | 0 |  |  |
| 2.922499999999949 | 0 |  |  |
| 2.924999999999949 | 0 |  |  |
| 2.927499999999949 | 0 |  |  |
| 2.929999999999949 | 0 |  |  |
| 2.932499999999949 | 0 |  |  |
| 2.934999999999949 | 0 |  |  |
| 2.937499999999948 | 0 |  |  |
| 2.939999999999948 | 0 |  |  |
| 2.942499999999948 | 0 |  |  |
| 2.944999999999948 | 0 |  |  |
| 2.947499999999948 | 0 |  |  |
| 2.949999999999948 | 0 |  |  |
| 2.952499999999948 | 0 |  |  |
| 2.954999999999948 | 0 |  |  |
| 2.957499999999948 | 0 |  |  |
| 2.959999999999948 | 0 |  |  |
| 2.962499999999948 | 0 |  |  |
| 2.964999999999948 | 0 |  |  |
| 2.967499999999948 | 0 |  |  |
| 2.969999999999948 | 0 |  |  |
| 2.972499999999948 | 0 |  |  |
| 2.974999999999948 | 0 |  |  |
| 2.977499999999948 | 0 |  |  |
| 2.979999999999948 | 0 |  |  |
| 2.982499999999947 | 0 |  |  |
| 2.984999999999947 | 0 |  |  |
| 2.987499999999947 | 0 |  |  |
| 2.989999999999947 | 0 |  |  |
| 2.992499999999947 | 0 |  |  |
| 2.994999999999947 | 0 |  |  |
| 2.997499999999947 | 0 |  |  |
| 2.999999999999947 | 0 |  |  |
| 3.002499999999947 | 0 |  |  |
| 3.004999999999947 | 0 |  |  |
| 3.007499999999947 | 0 |  |  |
| 3.009999999999947 | 0 |  |  |
| 3.012499999999947 | 0 |  |  |
| 3.014999999999947 | 0 |  |  |
| 3.017499999999947 | 0 |  |  |
| 3.019999999999947 | 0 |  |  |
| 3.022499999999947 | 0 |  |  |
| 3.024999999999947 | 0 |  |  |
| 3.027499999999947 | 0 |  |  |
| 3.029999999999947 | 0 |  |  |
| 3.032499999999946 | 0 |  |  |
| 3.034999999999946 | 0 |  |  |
| 3.037499999999946 | 0 |  |  |
| 3.039999999999946 | 0 |  |  |
| 3.042499999999946 | 0 |  |  |
| 3.044999999999946 | 0 |  |  |
| 3.047499999999946 | 0 |  |  |
| 3.049999999999946 | 0 |  |  |
| 3.052499999999946 | 0 |  |  |
| 3.054999999999946 | 0 |  |  |
| 3.057499999999946 | 0 |  |  |
| 3.059999999999946 | 0 |  |  |
| 3.062499999999946 | 0 |  |  |
| 3.064999999999946 | 0 |  |  |
| 3.067499999999946 | 0 |  |  |
| 3.069999999999946 | 0 |  |  |
| 3.072499999999946 | 0 |  |  |
| 3.074999999999946 | 0 |  |  |
| 3.077499999999945 | 0 |  |  |
| 3.079999999999945 | 0 |  |  |
| 3.082499999999945 | 0 |  |  |
| 3.084999999999945 | 0 |  |  |
| 3.087499999999945 | 0 |  |  |
| 3.089999999999945 | 0 |  |  |
| 3.092499999999945 | 0 |  |  |
| 3.094999999999945 | 0 |  |  |
| 3.097499999999945 | 0 |  |  |
| 3.099999999999945 | 0 |  |  |
| 3.102499999999945 | 0 |  |  |
| 3.104999999999945 | 0 |  |  |
| 3.107499999999945 | 0 |  |  |
| 3.109999999999945 | 0 |  |  |
| 3.112499999999945 | 0 |  |  |
| 3.114999999999945 | 0 |  |  |
| 3.117499999999945 | 0 |  |  |
| 3.119999999999945 | 0 |  |  |
| 3.122499999999945 | 0 |  |  |
| 3.124999999999944 | 0 |  |  |
| 3.127499999999944 | 0 |  |  |
| 3.129999999999944 | 0 |  |  |
| 3.132499999999944 | 0 |  |  |
| 3.134999999999944 | 0 |  |  |
| 3.137499999999944 | 0 |  |  |
| 3.139999999999944 | 0 |  |  |
| 3.142499999999944 | 0 |  |  |
| 3.144999999999944 | 0 |  |  |
| 3.147499999999944 | 0 |  |  |
| 3.149999999999944 | 0 |  |  |
| 3.152499999999944 | 0 |  |  |
| 3.154999999999944 | 0 |  |  |
| 3.157499999999944 | 0 |  |  |
| 3.159999999999944 | 0 |  |  |
| 3.162499999999944 | 0 |  |  |
| 3.164999999999944 | 0 |  |  |
| 3.167499999999944 | 0 |  |  |
| 3.169999999999944 | 0 |  |  |
| 3.172499999999943 | 0 |  |  |
| 3.174999999999943 | 0 |  |  |
| 3.177499999999943 | 0 |  |  |
| 3.179999999999943 | 0 |  |  |
| 3.182499999999943 | 0 |  |  |
| 3.184999999999943 | 0 |  |  |
| 3.187499999999943 | 0 |  |  |
| 3.189999999999943 | 0 |  |  |
| 3.192499999999943 | 0 |  |  |
| 3.194999999999943 | 0 |  |  |
| 3.197499999999943 | 0 |  |  |
| 3.199999999999943 | 0 |  |  |
| 3.202499999999943 | 0 |  |  |
| 3.204999999999943 | 0 |  |  |
| 3.207499999999943 | 0 |  |  |
| 3.209999999999943 | 0 |  |  |
| 3.212499999999943 | 0 |  |  |
| 3.214999999999943 | 0 |  |  |
| 3.217499999999943 | 0 |  |  |
| 3.219999999999942 | 0 |  |  |
| 3.222499999999942 | 0 |  |  |
| 3.224999999999942 | 0 |  |  |
| 3.227499999999942 | 0 |  |  |
| 3.229999999999942 | 0 |  |  |
| 3.232499999999942 | 0 |  |  |
| 3.234999999999942 | 0 |  |  |
| 3.237499999999942 | 0 |  |  |
| 3.239999999999942 | 0 |  |  |
| 3.242499999999942 | 0 |  |  |
| 3.244999999999942 | 0 |  |  |
| 3.247499999999942 | 0 |  |  |
| 3.249999999999942 | 0 |  |  |
| 3.252499999999942 | 0 |  |  |
| 3.254999999999942 | 0 |  |  |
| 3.257499999999942 | 0 |  |  |
| 3.259999999999942 | 0 |  |  |
| 3.262499999999942 | 0 |  |  |
| 3.264999999999941 | 0 |  |  |
| 3.267499999999941 | 0 |  |  |
| 3.269999999999941 | 0 |  |  |
| 3.272499999999941 | 0 |  |  |
| 3.274999999999941 | 0 |  |  |
| 3.277499999999941 | 0 |  |  |
| 3.279999999999941 | 0 |  |  |
| 3.282499999999941 | 0 |  |  |
| 3.284999999999941 | 0 |  |  |
| 3.287499999999941 | 0 |  |  |
| 3.289999999999941 | 0 |  |  |
| 3.292499999999941 | 0 |  |  |
| 3.294999999999941 | 0 |  |  |
| 3.297499999999941 | 0 |  |  |
| 3.299999999999941 | 0 |  |  |
| 3.302499999999941 | 0 |  |  |
| 3.304999999999941 | 0 |  |  |
| 3.307499999999941 | 0 |  |  |
| 3.30999999999994 | 0 |  |  |
| 3.31249999999994 | 0 |  |  |
| 3.31499999999994 | 0 |  |  |
| 3.31749999999994 | 0 |  |  |
| 3.31999999999994 | 0 |  |  |
| 3.32249999999994 | 0 |  |  |
| 3.32499999999994 | 0 |  |  |
| 3.32749999999994 | 0 |  |  |
| 3.32999999999994 | 0 |  |  |
| 3.33249999999994 | 0 |  |  |
| 3.33499999999994 | 0 |  |  |
| 3.33749999999994 | 0 |  |  |
| 3.33999999999994 | 0 |  |  |
| 3.34249999999994 | 0 |  |  |
| 3.34499999999994 | 0 |  |  |
| 3.34749999999994 | 0 |  |  |
| 3.34999999999994 | 0 |  |  |
| 3.35249999999994 | 0 |  |  |
| 3.35499999999994 | 0 |  |  |
| 3.357499999999939 | 0 |  |  |
| 3.359999999999939 | 0 |  |  |
| 3.362499999999939 | 0 |  |  |
| 3.364999999999939 | 0 |  |  |
| 3.367499999999939 | 0 |  |  |
| 3.369999999999939 | 0 |  |  |
| 3.372499999999939 | 0 |  |  |
| 3.374999999999939 | 0 |  |  |
| 3.377499999999939 | 0 |  |  |
| 3.379999999999939 | 0 |  |  |
| 3.382499999999939 | 0 |  |  |
| 3.384999999999939 | 0 |  |  |
| 3.387499999999939 | 0 |  |  |
| 3.389999999999939 | 0 |  |  |
| 3.392499999999939 | 0 |  |  |
| 3.394999999999939 | 0 |  |  |
| 3.397499999999939 | 0 |  |  |
| 3.399999999999939 | 0 |  |  |
| 3.402499999999939 | 0 |  |  |
| 3.404999999999938 | 0 |  |  |
| 3.407499999999938 | 0 |  |  |
| 3.409999999999938 | 0 |  |  |
| 3.412499999999938 | 0 |  |  |
| 3.414999999999938 | 0 |  |  |
| 3.417499999999938 | 0 |  |  |
| 3.419999999999938 | 0 |  |  |
| 3.422499999999938 | 0 |  |  |
| 3.424999999999938 | 0 |  |  |
| 3.427499999999938 | 0 |  |  |
| 3.429999999999938 | 0 |  |  |
| 3.432499999999938 | 0 |  |  |
| 3.434999999999938 | 0 |  |  |
| 3.437499999999938 | 0 |  |  |
| 3.439999999999938 | 0 |  |  |
| 3.442499999999938 | 0 |  |  |
| 3.444999999999938 | 0 |  |  |
| 3.447499999999938 | 0 |  |  |
| 3.449999999999938 | 0 |  |  |
| 3.452499999999937 | 0 |  |  |
| 3.454999999999937 | 0 |  |  |
| 3.457499999999937 | 0 |  |  |
| 3.459999999999937 | 0 |  |  |
| 3.462499999999937 | 0 |  |  |
| 3.464999999999937 | 0 |  |  |
| 3.467499999999937 | 0 |  |  |
| 3.469999999999937 | 0 |  |  |
| 3.472499999999937 | 0 |  |  |
| 3.474999999999937 | 0 |  |  |
| 3.477499999999937 | 0 |  |  |
| 3.479999999999937 | 0 |  |  |
| 3.482499999999937 | 0 |  |  |
| 3.484999999999937 | 0 |  |  |
| 3.487499999999937 | 0 |  |  |
| 3.489999999999937 | 0 |  |  |
| 3.492499999999937 | 0 |  |  |
| 3.494999999999937 | 0 |  |  |
| 3.497499999999936 | 0 |  |  |
| 3.499999999999936 | 0 |  |  |
| 3.502499999999936 | 0 |  |  |
| 3.504999999999936 | 0 |  |  |
| 3.507499999999936 | 0 |  |  |
| 3.509999999999936 | 0 |  |  |
| 3.512499999999936 | 0 |  |  |
| 3.514999999999936 | 0 |  |  |
| 3.517499999999936 | 0 |  |  |
| 3.519999999999936 | 0 |  |  |
| 3.522499999999936 | 0 |  |  |
| 3.524999999999936 | 0 |  |  |
| 3.527499999999936 | 0 |  |  |
| 3.529999999999936 | 0 |  |  |
| 3.532499999999936 | 0 |  |  |
| 3.534999999999936 | 0 |  |  |
| 3.537499999999936 | 0 |  |  |
| 3.539999999999936 | 0 |  |  |
| 3.542499999999936 | 0 |  |  |
| 3.544999999999936 | 0 |  |  |
| 3.547499999999935 | 0 |  |  |
| 3.549999999999935 | 0 |  |  |
| 3.552499999999935 | 0 |  |  |
| 3.554999999999935 | 0 |  |  |
| 3.557499999999935 | 0 |  |  |
| 3.559999999999935 | 0 |  |  |
| 3.562499999999935 | 0 |  |  |
| 3.564999999999935 | 0 |  |  |
| 3.567499999999935 | 0 |  |  |
| 3.569999999999935 | 0 |  |  |
| 3.572499999999935 | 0 |  |  |
| 3.574999999999935 | 0 |  |  |
| 3.577499999999935 | 0 |  |  |
| 3.579999999999935 | 0 |  |  |
| 3.582499999999935 | 0 |  |  |
| 3.584999999999935 | 0 |  |  |
| 3.587499999999935 | 0 |  |  |
| 3.589999999999935 | 0 |  |  |
| 3.592499999999934 | 0 |  |  |
| 3.594999999999934 | 0 |  |  |
| 3.597499999999934 | 0 |  |  |
| 3.599999999999934 | 0 |  |  |
| 3.602499999999934 | 0 |  |  |
| 3.604999999999934 | 0 |  |  |
| 3.607499999999934 | 0 |  |  |
| 3.609999999999934 | 0 |  |  |
| 3.612499999999934 | 0 |  |  |
| 3.614999999999934 | 0 |  |  |
| 3.617499999999934 | 0 |  |  |
| 3.619999999999934 | 0 |  |  |
| 3.622499999999934 | 0 |  |  |
| 3.624999999999934 | 0 |  |  |
| 3.627499999999934 | 0 |  |  |
| 3.629999999999934 | 0 |  |  |
| 3.632499999999934 | 0 |  |  |
| 3.634999999999934 | 0 |  |  |
| 3.637499999999933 | 0 |  |  |
| 3.639999999999933 | 0 |  |  |
| 3.642499999999933 | 0 |  |  |
| 3.644999999999933 | 0 |  |  |
| 3.647499999999933 | 0 |  |  |
| 3.649999999999933 | 0 |  |  |
| 3.652499999999933 | 0 |  |  |
| 3.654999999999933 | 0 |  |  |
| 3.657499999999933 | 0 |  |  |
| 3.659999999999933 | 0 |  |  |
| 3.662499999999933 | 0 |  |  |
| 3.664999999999933 | 0 |  |  |
| 3.667499999999933 | 0 |  |  |
| 3.669999999999933 | 0 |  |  |
| 3.672499999999933 | 0 |  |  |
| 3.674999999999933 | 0 |  |  |
| 3.677499999999933 | 0 |  |  |
| 3.679999999999933 | 0 |  |  |
| 3.682499999999933 | 0 |  |  |
| 3.684999999999932 | 0 |  |  |
| 3.687499999999932 | 0 |  |  |
| 3.689999999999932 | 0 |  |  |
| 3.692499999999932 | 0 |  |  |
| 3.694999999999932 | 0 |  |  |
| 3.697499999999932 | 0 |  |  |
| 3.699999999999932 | 0 |  |  |
| 3.702499999999932 | 0 |  |  |
| 3.704999999999932 | 0 |  |  |
| 3.707499999999932 | 0 |  |  |
| 3.709999999999932 | 0 |  |  |
| 3.712499999999932 | 0 |  |  |
| 3.714999999999932 | 0 |  |  |
| 3.717499999999932 | 0 |  |  |
| 3.719999999999932 | 0 |  |  |
| 3.722499999999932 | 0 |  |  |
| 3.724999999999932 | 0 |  |  |
| 3.727499999999932 | 0 |  |  |
| 3.729999999999932 | 0 |  |  |
| 3.732499999999931 | 0 |  |  |
| 3.734999999999931 | 0 |  |  |
| 3.737499999999931 | 0 |  |  |
| 3.739999999999931 | 0 |  |  |
| 3.742499999999931 | 0 |  |  |
| 3.744999999999931 | 0 |  |  |
| 3.747499999999931 | 0 |  |  |
| 3.749999999999931 | 0 |  |  |
| 3.752499999999931 | 0 |  |  |
| 3.754999999999931 | 0 |  |  |
| 3.757499999999931 | 0 |  |  |
| 3.759999999999931 | 0 |  |  |
| 3.762499999999931 | 0 |  |  |
| 3.764999999999931 | 0 |  |  |
| 3.767499999999931 | 0 |  |  |
| 3.769999999999931 | 0 |  |  |
| 3.772499999999931 | 0 |  |  |
| 3.774999999999931 | 0 |  |  |
| 3.777499999999931 | 0 |  |  |
| 3.77999999999993 | 0 |  |  |
| 3.78249999999993 | 0 |  |  |
| 3.78499999999993 | 0 |  |  |
| 3.78749999999993 | 0 |  |  |
| 3.78999999999993 | 0 |  |  |
| 3.79249999999993 | 0 |  |  |
| 3.79499999999993 | 0 |  |  |
| 3.79749999999993 | 0 |  |  |
| 3.79999999999993 | 0 |  |  |
| 3.80249999999993 | 0 |  |  |
| 3.80499999999993 | 0 |  |  |
| 3.80749999999993 | 0 |  |  |
| 3.80999999999993 | 0 |  |  |
| 3.81249999999993 | 0 |  |  |
| 3.81499999999993 | 0 |  |  |
| 3.81749999999993 | 0 |  |  |
| 3.81999999999993 | 0 |  |  |
| 3.82249999999993 | 0 |  |  |
| 3.82499999999993 | 0 |  |  |
| 3.827499999999929 | 0 |  |  |
| 3.829999999999929 | 0 |  |  |
| 3.832499999999929 | 0 |  |  |
| 3.834999999999929 | 0 |  |  |
| 3.837499999999929 | 0 |  |  |
| 3.839999999999929 | 0 |  |  |
| 3.842499999999929 | 0 |  |  |
| 3.844999999999929 | 0 |  |  |
| 3.847499999999929 | 0 |  |  |
| 3.849999999999929 | 0 |  |  |
| 3.852499999999929 | 0 |  |  |
| 3.854999999999929 | 0 |  |  |
| 3.857499999999929 | 0 |  |  |
| 3.859999999999929 | 0 |  |  |
| 3.862499999999929 | 0 |  |  |
| 3.864999999999929 | 0 |  |  |
| 3.867499999999929 | 0 |  |  |
| 3.869999999999929 | 0 |  |  |
| 3.872499999999929 | 0 |  |  |
| 3.874999999999928 | 0 |  |  |
| 3.877499999999928 | 0 |  |  |
| 3.879999999999928 | 0 |  |  |
| 3.882499999999928 | 0 |  |  |
| 3.884999999999928 | 0 |  |  |
| 3.887499999999928 | 0 |  |  |
| 3.889999999999928 | 0 |  |  |
| 3.892499999999928 | 0 |  |  |
| 3.894999999999928 | 0 |  |  |
| 3.897499999999928 | 0 |  |  |
| 3.899999999999928 | 0 |  |  |
| 3.902499999999928 | 0 |  |  |
| 3.904999999999928 | 0 |  |  |
| 3.907499999999928 | 0 |  |  |
| 3.909999999999928 | 0 |  |  |
| 3.912499999999928 | 0 |  |  |
| 3.914999999999928 | 0 |  |  |
| 3.917499999999928 | 0 |  |  |
| 3.919999999999928 | 0 |  |  |
| 3.922499999999927 | 0 |  |  |
| 3.924999999999927 | 0 |  |  |
| 3.927499999999927 | 0 |  |  |
| 3.929999999999927 | 0 |  |  |
| 3.932499999999927 | 0 |  |  |
| 3.934999999999927 | 0 |  |  |
| 3.937499999999927 | 0 |  |  |
| 3.939999999999927 | 0 |  |  |
| 3.942499999999927 | 0 |  |  |
| 3.944999999999927 | 0 |  |  |
| 3.947499999999927 | 0 |  |  |
| 3.949999999999927 | 0 |  |  |
| 3.952499999999927 | 0 |  |  |
| 3.954999999999927 | 0 |  |  |
| 3.957499999999927 | 0 |  |  |
| 3.959999999999927 | 0 |  |  |
| 3.962499999999927 | 0 |  |  |
| 3.964999999999927 | 0 |  |  |
| 3.967499999999926 | 0 |  |  |
| 3.969999999999926 | 0 |  |  |
| 3.972499999999926 | 0 |  |  |
| 3.974999999999926 | 0 |  |  |
| 3.977499999999926 | 0 |  |  |
| 3.979999999999926 | 0 |  |  |
| 3.982499999999926 | 0 |  |  |
| 3.984999999999926 | 0 |  |  |
| 3.987499999999926 | 0 |  |  |
| 3.989999999999926 | 0 |  |  |
| 3.992499999999926 | 0 |  |  |
| 3.994999999999926 | 0 |  |  |
| 3.997499999999926 | 0 |  |  |
| 3.999999999999926 | 0 |  |  |
| 4.002499999999925 | 0 |  |  |
| 4.004999999999926 | 0 |  |  |
| 4.007499999999926 | 0 |  |  |
| 4.009999999999926 | 0 |  |  |
| 4.012499999999927 | 0 |  |  |
| 4.014999999999928 | 0 |  |  |
| 4.017499999999928 | 0 |  |  |
| 4.019999999999928 | 0 |  |  |
| 4.022499999999929 | 0 |  |  |
| 4.024999999999929 | 0 |  |  |
| 4.02749999999993 | 0 |  |  |
| 4.02999999999993 | 0 |  |  |
| 4.03249999999993 | 0 |  |  |
| 4.034999999999931 | 0 |  |  |
| 4.037499999999931 | 0 |  |  |
| 4.039999999999931 | 0 |  |  |
| 4.042499999999932 | 0 |  |  |
| 4.044999999999932 | 0 |  |  |
| 4.047499999999933 | 0 |  |  |
| 4.049999999999933 | 0 |  |  |
| 4.052499999999934 | 0 |  |  |
| 4.054999999999934 | 0 |  |  |
| 4.057499999999934 | 0 |  |  |
| 4.059999999999934 | 0 |  |  |
| 4.062499999999935 | 0 |  |  |
| 4.064999999999936 | 0 |  |  |
| 4.067499999999936 | 0 |  |  |
| 4.069999999999936 | 0 |  |  |
| 4.072499999999936 | 0 |  |  |
| 4.074999999999937 | 0 |  |  |
| 4.077499999999937 | 0 |  |  |
| 4.079999999999937 | 0 |  |  |
| 4.082499999999938 | 0 |  |  |
| 4.084999999999939 | 0 |  |  |
| 4.08749999999994 | 0 |  |  |
| 4.08999999999994 | 0 |  |  |
| 4.09249999999994 | 0 |  |  |
| 4.09499999999994 | 0 |  |  |
| 4.097499999999941 | 0 |  |  |
| 4.099999999999941 | 0 |  |  |
| 4.102499999999941 | 0 |  |  |
| 4.104999999999942 | 0 |  |  |
| 4.107499999999942 | 0 |  |  |
| 4.109999999999943 | 0 |  |  |
| 4.112499999999943 | 0 |  |  |
| 4.114999999999943 | 0 |  |  |
| 4.117499999999944 | 0 |  |  |
| 4.119999999999944 | 0 |  |  |
| 4.122499999999945 | 0 |  |  |
| 4.124999999999945 | 0 |  |  |
| 4.127499999999945 | 0 |  |  |
| 4.129999999999946 | 0 |  |  |
| 4.132499999999946 | 0 |  |  |
| 4.134999999999946 | 0 |  |  |
| 4.137499999999947 | 0 |  |  |
| 4.139999999999947 | 0 |  |  |
| 4.142499999999948 | 0 |  |  |
| 4.144999999999948 | 0 |  |  |
| 4.147499999999948 | 0 |  |  |
| 4.149999999999949 | 0 |  |  |
| 4.152499999999949 | 0 |  |  |
| 4.15499999999995 | 0 |  |  |
| 4.15749999999995 | 0 |  |  |
| 4.15999999999995 | 0 |  |  |
| 4.162499999999951 | 0 |  |  |
| 4.164999999999951 | 0 |  |  |
| 4.167499999999952 | 0 |  |  |
| 4.169999999999952 | 0 |  |  |
| 4.172499999999952 | 0 |  |  |
| 4.174999999999953 | 0 |  |  |
| 4.177499999999953 | 0 |  |  |
| 4.179999999999954 | 0 |  |  |
| 4.182499999999954 | 0 |  |  |
| 4.184999999999954 | 0 |  |  |
| 4.187499999999955 | 0 |  |  |
| 4.189999999999955 | 0 |  |  |
| 4.192499999999955 | 0 |  |  |
| 4.194999999999956 | 0 |  |  |
| 4.197499999999956 | 0 |  |  |
| 4.199999999999957 | 0 |  |  |
| 4.202499999999957 | 0 |  |  |
| 4.204999999999957 | 0 |  |  |
| 4.207499999999958 | 0 |  |  |
| 4.209999999999958 | 0 |  |  |
| 4.212499999999959 | 0 |  |  |
| 4.214999999999959 | 0 |  |  |
| 4.217499999999959 | 0 |  |  |
| 4.21999999999996 | 0 |  |  |
| 4.22249999999996 | 0 |  |  |
| 4.224999999999961 | 0 |  |  |
| 4.227499999999961 | 0 |  |  |
| 4.229999999999961 | 0 |  |  |
| 4.232499999999961 | 0 |  |  |
| 4.234999999999962 | 0 |  |  |
| 4.237499999999962 | 0 |  |  |
| 4.239999999999962 | 0 |  |  |
| 4.242499999999963 | 0 |  |  |
| 4.244999999999964 | 0 |  |  |
| 4.247499999999964 | 0 |  |  |
| 4.249999999999964 | 0 |  |  |
| 4.252499999999964 | 0 |  |  |
| 4.254999999999965 | 0 |  |  |
| 4.257499999999965 | 0 |  |  |
| 4.259999999999966 | 0 |  |  |
| 4.262499999999966 | 0 |  |  |
| 4.264999999999967 | 0 |  |  |
| 4.267499999999967 | 0 |  |  |
| 4.269999999999967 | 0 |  |  |
| 4.272499999999967 | 0 |  |  |
| 4.274999999999968 | 0 |  |  |
| 4.277499999999968 | 0 |  |  |
| 4.27999999999997 | 0 |  |  |
| 4.28249999999997 | 0 |  |  |
| 4.28499999999997 | 0 |  |  |
| 4.28749999999997 | 0 |  |  |
| 4.28999999999997 | 0 |  |  |
| 4.292499999999971 | 0 |  |  |
| 4.294999999999971 | 0 |  |  |
| 4.297499999999972 | 0 |  |  |
| 4.299999999999972 | 0 |  |  |
| 4.302499999999973 | 0 |  |  |
| 4.304999999999973 | 0 |  |  |
| 4.307499999999973 | 0 |  |  |
| 4.309999999999974 | 0 |  |  |
| 4.312499999999974 | 0 |  |  |
| 4.314999999999975 | 0 |  |  |
| 4.317499999999975 | 0 |  |  |
| 4.319999999999975 | 0 |  |  |
| 4.322499999999976 | 0 |  |  |
| 4.324999999999976 | 0 |  |  |
| 4.327499999999977 | 0 |  |  |
| 4.329999999999977 | 0 |  |  |
| 4.332499999999977 | 0 |  |  |
| 4.334999999999978 | 0 |  |  |
| 4.337499999999978 | 0 |  |  |
| 4.339999999999978 | 0 |  |  |
| 4.342499999999979 | 0 |  |  |
| 4.344999999999979 | 0 |  |  |
| 4.34749999999998 | 0 |  |  |
| 4.34999999999998 | 0 |  |  |
| 4.35249999999998 | 0 |  |  |
| 4.354999999999981 | 0 |  |  |
| 4.357499999999981 | 0 |  |  |
| 4.359999999999982 | 0 |  |  |
| 4.362499999999982 | 0 |  |  |
| 4.364999999999982 | 0 |  |  |
| 4.367499999999983 | 0 |  |  |
| 4.369999999999983 | 0 |  |  |
| 4.372499999999984 | 0 |  |  |
| 4.374999999999984 | 0 |  |  |
| 4.377499999999984 | 0 |  |  |
| 4.379999999999984 | 0 |  |  |
| 4.382499999999985 | 0 |  |  |
| 4.384999999999986 | 0 |  |  |
| 4.387499999999986 | 0 |  |  |
| 4.389999999999986 | 0 |  |  |
| 4.392499999999987 | 0 |  |  |
| 4.394999999999987 | 0 |  |  |
| 4.397499999999987 | 0 |  |  |
| 4.399999999999988 | 0 |  |  |
| 4.402499999999988 | 0 |  |  |
| 4.404999999999989 | 0 |  |  |
| 4.40749999999999 | 0 |  |  |
| 4.40999999999999 | 0 |  |  |
| 4.41249999999999 | 0 |  |  |
| 4.41499999999999 | 0 |  |  |
| 4.417499999999991 | 0 |  |  |
| 4.419999999999991 | 0 |  |  |
| 4.422499999999991 | 0 |  |  |
| 4.424999999999992 | 0 |  |  |
| 4.427499999999992 | 0 |  |  |
| 4.429999999999993 | 0 |  |  |
| 4.432499999999993 | 0 |  |  |
| 4.434999999999993 | 0 |  |  |
| 4.437499999999994 | 0 |  |  |
| 4.439999999999994 | 0 |  |  |
| 4.442499999999994 | 0 |  |  |
| 4.444999999999995 | 0 |  |  |
| 4.447499999999995 | 0 |  |  |
| 4.449999999999995 | 0 |  |  |
| 4.452499999999996 | 0 |  |  |
| 4.454999999999996 | 0 |  |  |
| 4.457499999999997 | 0 |  |  |
| 4.459999999999997 | 0 |  |  |
| 4.462499999999998 | 0 |  |  |
| 4.464999999999998 | 0 |  |  |
| 4.467499999999998 | 0 |  |  |
| 4.469999999999999 | 0 |  |  |
| 4.4725 | 0 |  |  |
| 4.475 | 0 |  |  |
| 4.4775 | 0 |  |  |
| 4.48 | 0 |  |  |
| 4.482500000000001 | 0 |  |  |
| 4.485000000000001 | 0 |  |  |
| 4.487500000000002 | 0 |  |  |
| 4.490000000000002 | 0 |  |  |
| 4.492500000000002 | 0 |  |  |
| 4.495000000000003 | 0 |  |  |
| 4.497500000000003 | 0 |  |  |
| 4.500000000000004 | 0 |  |  |
| 4.502500000000004 | 0 |  |  |
| 4.505000000000004 | 0 |  |  |
| 4.507500000000005 | 0 |  |  |
| 4.510000000000005 | 0 |  |  |
| 4.512500000000006 | 0 |  |  |
| 4.515000000000006 | 0 |  |  |
| 4.517500000000006 | 0 |  |  |
| 4.520000000000007 | 0 |  |  |
| 4.522500000000007 | 0 |  |  |
| 4.525000000000007 | 0 |  |  |
| 4.527500000000008 | 0 |  |  |
| 4.530000000000008 | 0 |  |  |
| 4.532500000000009 | 0 |  |  |
| 4.53500000000001 | 0 |  |  |
| 4.537500000000009 | 0 |  |  |
| 4.54000000000001 | 0 |  |  |
| 4.54250000000001 | 0 |  |  |
| 4.545000000000011 | 0 |  |  |
| 4.547500000000011 | 0 |  |  |
| 4.550000000000011 | 0 |  |  |
| 4.552500000000012 | 0 |  |  |
| 4.555000000000012 | 0 |  |  |
| 4.557500000000013 | 0 |  |  |
| 4.560000000000013 | 0 |  |  |
| 4.562500000000013 | 0 |  |  |
| 4.565000000000014 | 0 |  |  |
| 4.567500000000014 | 0 |  |  |
| 4.570000000000014 | 0 |  |  |
| 4.572500000000015 | 0 |  |  |
| 4.575000000000015 | 0 |  |  |
| 4.577500000000016 | 0 |  |  |
| 4.580000000000016 | 0 |  |  |
| 4.582500000000016 | 0 |  |  |
| 4.585000000000017 | 0 |  |  |
| 4.587500000000017 | 0 |  |  |
| 4.590000000000018 | 0 |  |  |
| 4.592500000000018 | 0 |  |  |
| 4.595000000000018 | 0 |  |  |
| 4.597500000000019 | 0 |  |  |
| 4.600000000000019 | 0 |  |  |
| 4.602500000000019 | 0 |  |  |
| 4.60500000000002 | 0 |  |  |
| 4.60750000000002 | 0 |  |  |
| 4.610000000000021 | 0 |  |  |
| 4.612500000000021 | 0 |  |  |
| 4.615000000000021 | 0 |  |  |
| 4.617500000000022 | 0 |  |  |
| 4.620000000000022 | 0 |  |  |
| 4.622500000000023 | 0 |  |  |
| 4.625000000000023 | 0 |  |  |
| 4.627500000000023 | 0 |  |  |
| 4.630000000000024 | 0 |  |  |
| 4.632500000000024 | 0 |  |  |
| 4.635000000000024 | 0 |  |  |
| 4.637500000000025 | 0 |  |  |
| 4.640000000000025 | 0 |  |  |
| 4.642500000000026 | 0 |  |  |
| 4.645000000000026 | 0 |  |  |
| 4.647500000000027 | 0 |  |  |
| 4.650000000000027 | 0 |  |  |
| 4.652500000000027 | 0 |  |  |
| 4.655000000000028 | 0 |  |  |
| 4.657500000000028 | 0 |  |  |
| 4.660000000000028 | 0 |  |  |
| 4.662500000000029 | 0 |  |  |
| 4.665000000000029 | 0 |  |  |
| 4.66750000000003 | 0 |  |  |
| 4.67000000000003 | 0 |  |  |
| 4.67250000000003 | 0 |  |  |
| 4.675000000000031 | 0 |  |  |
| 4.677500000000031 | 0 |  |  |
| 4.680000000000032 | 0 |  |  |
| 4.682500000000032 | 0 |  |  |
| 4.685000000000032 | 0 |  |  |
| 4.687500000000033 | 0 |  |  |
| 4.690000000000033 | 0 |  |  |
| 4.692500000000034 | 0 |  |  |
| 4.695000000000034 | 0 |  |  |
| 4.697500000000034 | 0 |  |  |
| 4.700000000000034 | 0 |  |  |
| 4.702500000000035 | 0 |  |  |
| 4.705000000000035 | 0 |  |  |
| 4.707500000000036 | 0 |  |  |
| 4.710000000000036 | 0 |  |  |
| 4.712500000000037 | 0 |  |  |
| 4.715000000000037 | 0 |  |  |
| 4.717500000000037 | 0 |  |  |
| 4.720000000000038 | 0 |  |  |
| 4.722500000000038 | 0 |  |  |
| 4.725000000000039 | 0 |  |  |
| 4.727500000000039 | 0 |  |  |
| 4.73000000000004 | 0 |  |  |
| 4.73250000000004 | 0 |  |  |
| 4.73500000000004 | 0 |  |  |
| 4.737500000000041 | 0 |  |  |
| 4.740000000000041 | 0 |  |  |
| 4.742500000000041 | 0 |  |  |
| 4.745000000000042 | 0 |  |  |
| 4.747500000000042 | 0 |  |  |
| 4.750000000000043 | 0 |  |  |
| 4.752500000000043 | 0 |  |  |
| 4.755000000000043 | 0 |  |  |
| 4.757500000000044 | 0 |  |  |
| 4.760000000000044 | 0 |  |  |
| 4.762500000000045 | 0 |  |  |
| 4.765000000000045 | 0 |  |  |
| 4.767500000000045 | 0 |  |  |
| 4.770000000000045 | 0 |  |  |
| 4.772500000000046 | 0 |  |  |
| 4.775000000000046 | 0 |  |  |
| 4.777500000000047 | 0 |  |  |
| 4.780000000000047 | 0 |  |  |
| 4.782500000000048 | 0 |  |  |
| 4.785000000000048 | 0 |  |  |
| 4.787500000000048 | 0 |  |  |
| 4.790000000000049 | 0 |  |  |
| 4.792500000000049 | 0 |  |  |
| 4.79500000000005 | 0 |  |  |
| 4.79750000000005 | 0 |  |  |
| 4.80000000000005 | 0 |  |  |
| 4.802500000000051 | 0 |  |  |
| 4.805000000000051 | 0 |  |  |
| 4.807500000000052 | 0 |  |  |
| 4.810000000000052 | 0 |  |  |
| 4.812500000000052 | 0 |  |  |
| 4.815000000000053 | 0 |  |  |
| 4.817500000000053 | 0 |  |  |
| 4.820000000000054 | 0 |  |  |
| 4.822500000000054 | 0 |  |  |
| 4.825000000000054 | 0 |  |  |
| 4.827500000000055 | 0 |  |  |
| 4.830000000000055 | 0 |  |  |
| 4.832500000000055 | 0 |  |  |
| 4.835000000000056 | 0 |  |  |
| 4.837500000000056 | 0 |  |  |
| 4.840000000000057 | 0 |  |  |
| 4.842500000000057 | 0 |  |  |
| 4.845000000000057 | 0 |  |  |
| 4.847500000000058 | 0 |  |  |
| 4.850000000000058 | 0 |  |  |
| 4.852500000000059 | 0 |  |  |
| 4.855000000000059 | 0 |  |  |
| 4.857500000000059 | 0 |  |  |
| 4.86000000000006 | 0 |  |  |
| 4.86250000000006 | 0 |  |  |
| 4.865000000000061 | 0 |  |  |
| 4.867500000000061 | 0 |  |  |
| 4.870000000000061 | 0 |  |  |
| 4.872500000000062 | 0 |  |  |
| 4.875000000000062 | 0 |  |  |
| 4.877500000000063 | 0 |  |  |
| 4.880000000000063 | 0 |  |  |
| 4.882500000000063 | 0 |  |  |
| 4.885000000000064 | 0 |  |  |
| 4.887500000000064 | 0 |  |  |
| 4.890000000000064 | 0 |  |  |
| 4.892500000000065 | 0 |  |  |
| 4.895000000000065 | 0 |  |  |
| 4.897500000000066 | 0 |  |  |
| 4.900000000000066 | 0 |  |  |
| 4.902500000000066 | 0 |  |  |
| 4.905000000000066 | 0 |  |  |
| 4.907500000000067 | 0 |  |  |
| 4.910000000000067 | 0 |  |  |
| 4.912500000000068 | 0 |  |  |
| 4.915000000000068 | 0 |  |  |
| 4.917500000000069 | 0 |  |  |
| 4.92000000000007 | 0 |  |  |
| 4.92250000000007 | 0 |  |  |
| 4.92500000000007 | 0 |  |  |
| 4.92750000000007 | 0 |  |  |
| 4.93000000000007 | 0 |  |  |
| 4.932500000000071 | 0 |  |  |
| 4.935000000000071 | 0 |  |  |
| 4.937500000000072 | 0 |  |  |
| 4.940000000000072 | 0 |  |  |
| 4.942500000000073 | 0 |  |  |
| 4.945000000000073 | 0 |  |  |
| 4.947500000000073 | 0 |  |  |
| 4.950000000000074 | 0 |  |  |
| 4.952500000000074 | 0 |  |  |
| 4.955000000000074 | 0 |  |  |
| 4.957500000000075 | 0 |  |  |
| 4.960000000000075 | 0 |  |  |
| 4.962500000000076 | 0 |  |  |
| 4.965000000000076 | 0 |  |  |
| 4.967500000000077 | 0 |  |  |
| 4.970000000000076 | 0 |  |  |
| 4.972500000000077 | 0 |  |  |
| 4.975000000000077 | 0 |  |  |
| 4.977500000000078 | 0 |  |  |
| 4.980000000000078 | 0 |  |  |
| 4.982500000000079 | 0 |  |  |
| 4.98500000000008 | 0 |  |  |
| 4.98750000000008 | 0 |  |  |
| 4.99000000000008 | 0 |  |  |
| 4.99250000000008 | 0 |  |  |
| 4.995000000000081 | 0 |  |  |
| 4.997500000000081 | 0 |  |  |
| 5.000000000000082 | 0 |  |  |